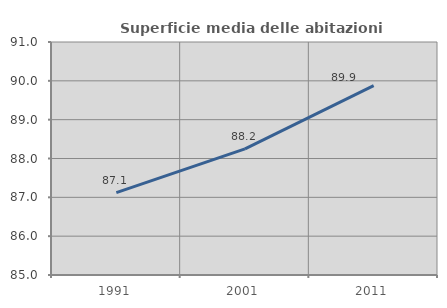
| Category | Superficie media delle abitazioni occupate |
|---|---|
| 1991.0 | 87.123 |
| 2001.0 | 88.249 |
| 2011.0 | 89.875 |